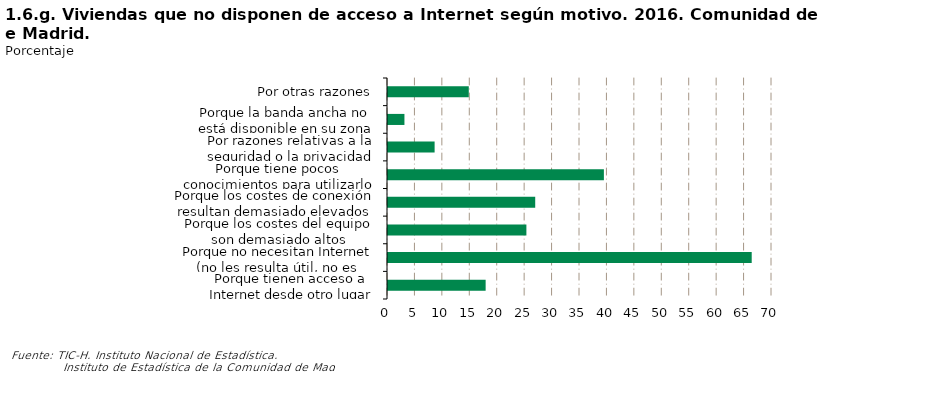
| Category | Series 0 |
|---|---|
| Porque tienen acceso a Internet desde otro lugar | 17.799 |
| Porque no necesitan Internet (no les resulta útil, no es interesante, etc.) | 66.301 |
| Porque los costes del equipo son demasiado altos | 25.228 |
| Porque los costes de conexión resultan demasiado elevados (teléfono, contrato de ADSL, etc.) | 26.837 |
| Porque tiene pocos conocimientos para utilizarlo | 39.354 |
| Por razones relativas a la seguridad o la privacidad | 8.497 |
| Porque la banda ancha no está disponible en su zona | 2.996 |
| Por otras razones | 14.725 |